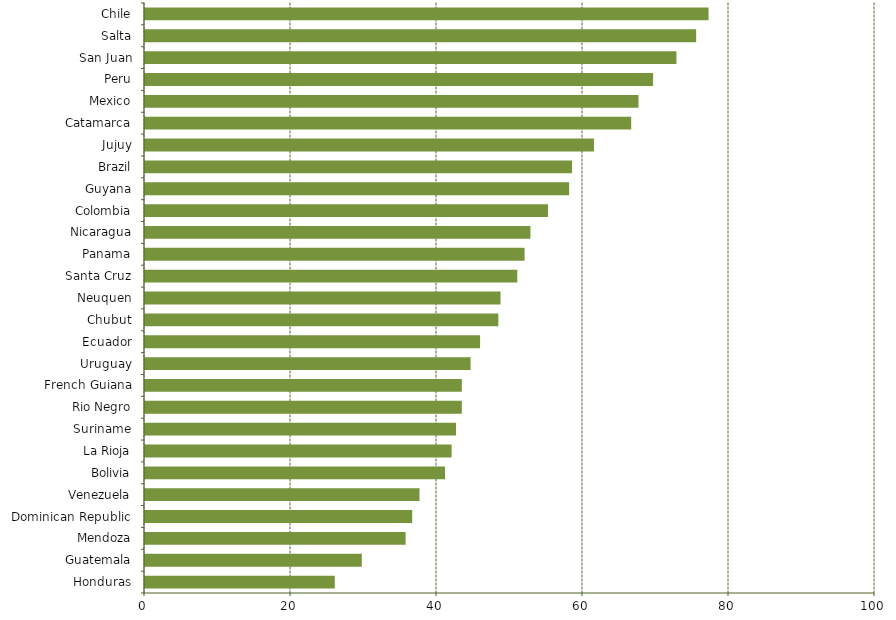
| Category | Series 0 |
|---|---|
| Honduras | 26 |
| Guatemala | 29.7 |
| Mendoza | 35.7 |
| Dominican Republic | 36.6 |
| Venezuela | 37.6 |
| Bolivia | 41.1 |
| La Rioja | 42 |
| Suriname | 42.6 |
| Rio Negro | 43.4 |
| French Guiana | 43.4 |
| Uruguay | 44.6 |
| Ecuador | 45.9 |
| Chubut | 48.4 |
| Neuquen | 48.7 |
| Santa Cruz | 51 |
| Panama | 52 |
| Nicaragua | 52.8 |
| Colombia | 55.2 |
| Guyana | 58.1 |
| Brazil | 58.5 |
| Jujuy | 61.5 |
| Catamarca | 66.6 |
| Mexico | 67.6 |
| Peru | 69.6 |
| San Juan | 72.8 |
| Salta | 75.5 |
| Chile | 77.2 |